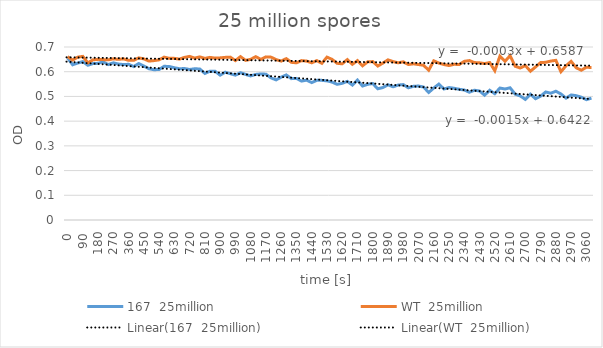
| Category | 167  25million | WT  25million |
|---|---|---|
| 0.0 | 0.656 | 0.661 |
| 30.0 | 0.628 | 0.647 |
| 60.0 | 0.635 | 0.659 |
| 90.0 | 0.641 | 0.662 |
| 120.0 | 0.626 | 0.636 |
| 150.0 | 0.633 | 0.648 |
| 180.0 | 0.634 | 0.65 |
| 210.0 | 0.64 | 0.649 |
| 240.0 | 0.629 | 0.648 |
| 270.0 | 0.636 | 0.652 |
| 300.0 | 0.631 | 0.65 |
| 330.0 | 0.629 | 0.652 |
| 360.0 | 0.63 | 0.646 |
| 390.0 | 0.621 | 0.646 |
| 420.0 | 0.633 | 0.656 |
| 450.0 | 0.623 | 0.652 |
| 480.0 | 0.612 | 0.643 |
| 510.0 | 0.608 | 0.645 |
| 540.0 | 0.609 | 0.648 |
| 570.0 | 0.622 | 0.659 |
| 600.0 | 0.621 | 0.654 |
| 630.0 | 0.616 | 0.654 |
| 660.0 | 0.612 | 0.651 |
| 690.0 | 0.613 | 0.658 |
| 720.0 | 0.609 | 0.662 |
| 750.0 | 0.612 | 0.655 |
| 780.0 | 0.611 | 0.66 |
| 810.0 | 0.593 | 0.654 |
| 840.0 | 0.602 | 0.658 |
| 870.0 | 0.602 | 0.655 |
| 900.0 | 0.586 | 0.656 |
| 930.0 | 0.598 | 0.658 |
| 960.0 | 0.592 | 0.659 |
| 990.0 | 0.586 | 0.645 |
| 1020.0 | 0.596 | 0.661 |
| 1050.0 | 0.589 | 0.646 |
| 1080.0 | 0.583 | 0.65 |
| 1110.0 | 0.589 | 0.661 |
| 1140.0 | 0.591 | 0.65 |
| 1170.0 | 0.59 | 0.66 |
| 1200.0 | 0.575 | 0.659 |
| 1230.0 | 0.567 | 0.649 |
| 1260.0 | 0.578 | 0.643 |
| 1290.0 | 0.587 | 0.653 |
| 1320.0 | 0.572 | 0.638 |
| 1350.0 | 0.573 | 0.636 |
| 1380.0 | 0.562 | 0.645 |
| 1410.0 | 0.566 | 0.643 |
| 1440.0 | 0.556 | 0.636 |
| 1470.0 | 0.565 | 0.645 |
| 1500.0 | 0.565 | 0.634 |
| 1530.0 | 0.563 | 0.659 |
| 1560.0 | 0.558 | 0.65 |
| 1590.0 | 0.549 | 0.634 |
| 1620.0 | 0.553 | 0.632 |
| 1650.0 | 0.561 | 0.649 |
| 1680.0 | 0.546 | 0.63 |
| 1710.0 | 0.566 | 0.645 |
| 1740.0 | 0.542 | 0.624 |
| 1770.0 | 0.549 | 0.64 |
| 1800.0 | 0.552 | 0.641 |
| 1830.0 | 0.531 | 0.623 |
| 1860.0 | 0.536 | 0.635 |
| 1890.0 | 0.547 | 0.648 |
| 1920.0 | 0.539 | 0.641 |
| 1950.0 | 0.546 | 0.636 |
| 1980.0 | 0.548 | 0.64 |
| 2010.0 | 0.535 | 0.629 |
| 2040.0 | 0.541 | 0.632 |
| 2070.0 | 0.542 | 0.629 |
| 2100.0 | 0.538 | 0.626 |
| 2130.0 | 0.516 | 0.606 |
| 2160.0 | 0.534 | 0.644 |
| 2190.0 | 0.55 | 0.635 |
| 2220.0 | 0.53 | 0.629 |
| 2250.0 | 0.536 | 0.625 |
| 2280.0 | 0.533 | 0.63 |
| 2310.0 | 0.529 | 0.629 |
| 2340.0 | 0.526 | 0.642 |
| 2370.0 | 0.517 | 0.645 |
| 2400.0 | 0.525 | 0.637 |
| 2430.0 | 0.522 | 0.636 |
| 2460.0 | 0.505 | 0.633 |
| 2490.0 | 0.525 | 0.637 |
| 2520.0 | 0.511 | 0.604 |
| 2550.0 | 0.534 | 0.663 |
| 2580.0 | 0.53 | 0.642 |
| 2610.0 | 0.535 | 0.665 |
| 2640.0 | 0.509 | 0.622 |
| 2670.0 | 0.502 | 0.615 |
| 2700.0 | 0.488 | 0.625 |
| 2730.0 | 0.509 | 0.602 |
| 2760.0 | 0.491 | 0.619 |
| 2790.0 | 0.501 | 0.637 |
| 2820.0 | 0.518 | 0.638 |
| 2850.0 | 0.513 | 0.643 |
| 2880.0 | 0.521 | 0.646 |
| 2910.0 | 0.51 | 0.6 |
| 2940.0 | 0.493 | 0.624 |
| 2970.0 | 0.506 | 0.642 |
| 3000.0 | 0.503 | 0.616 |
| 3030.0 | 0.497 | 0.606 |
| 3060.0 | 0.487 | 0.618 |
| 3090.0 | 0.493 | 0.617 |